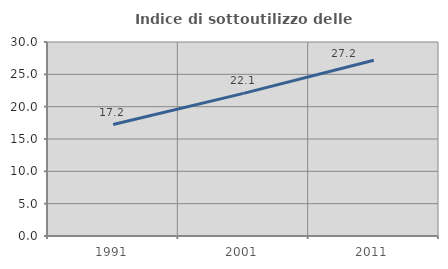
| Category | Indice di sottoutilizzo delle abitazioni  |
|---|---|
| 1991.0 | 17.236 |
| 2001.0 | 22.054 |
| 2011.0 | 27.186 |